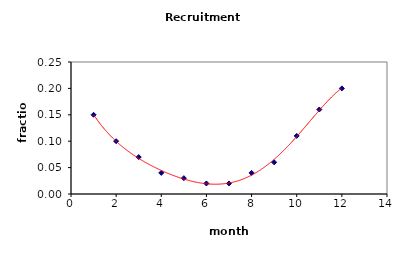
| Category | Recruit |
|---|---|
| 1.0 | 0.15 |
| 2.0 | 0.1 |
| 3.0 | 0.07 |
| 4.0 | 0.04 |
| 5.0 | 0.03 |
| 6.0 | 0.02 |
| 7.0 | 0.02 |
| 8.0 | 0.04 |
| 9.0 | 0.06 |
| 10.0 | 0.11 |
| 11.0 | 0.16 |
| 12.0 | 0.2 |